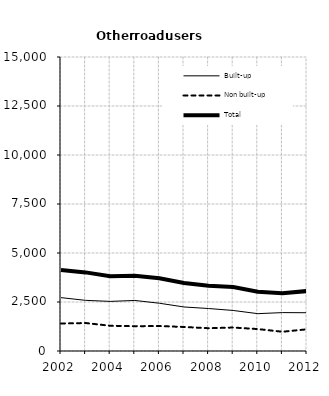
| Category | Built-up | Non built-up | Total |
|---|---|---|---|
| 2002.0 | 2723 | 1404 | 4127 |
| 2003.0 | 2584 | 1427 | 4011 |
| 2004.0 | 2531 | 1288 | 3819 |
| 2005.0 | 2579 | 1266 | 3845 |
| 2006.0 | 2437 | 1274 | 3711 |
| 2007.0 | 2246 | 1226 | 3472 |
| 2008.0 | 2167 | 1162 | 3329 |
| 2009.0 | 2068 | 1197 | 3265 |
| 2010.0 | 1905 | 1119 | 3024 |
| 2011.0 | 1959 | 983 | 2942 |
| 2012.0 | 1953 | 1107 | 3060 |